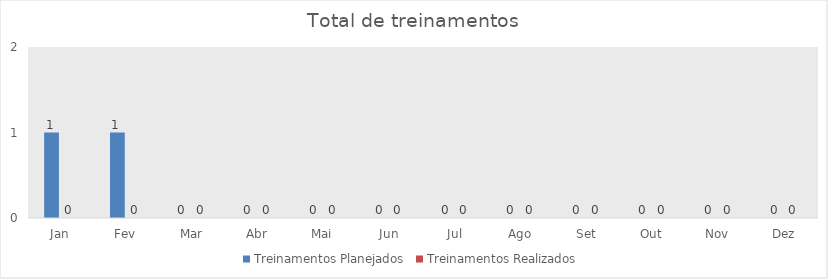
| Category | Treinamentos Planejados | Treinamentos Realizados |
|---|---|---|
| Jan | 1 | 0 |
| Fev | 1 | 0 |
| Mar | 0 | 0 |
| Abr | 0 | 0 |
| Mai | 0 | 0 |
| Jun | 0 | 0 |
| Jul | 0 | 0 |
| Ago | 0 | 0 |
| Set | 0 | 0 |
| Out | 0 | 0 |
| Nov | 0 | 0 |
| Dez | 0 | 0 |